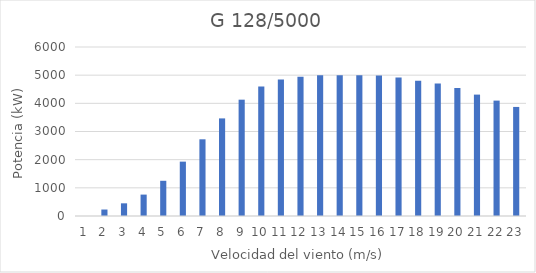
| Category | G 128/5000 |
|---|---|
| 0 | 0 |
| 1 | 230 |
| 2 | 450 |
| 3 | 760 |
| 4 | 1250 |
| 5 | 1930 |
| 6 | 2723 |
| 7 | 3465 |
| 8 | 4130 |
| 9 | 4600 |
| 10 | 4850 |
| 11 | 4940 |
| 12 | 5000 |
| 13 | 5000 |
| 14 | 5000 |
| 15 | 4992 |
| 16 | 4916 |
| 17 | 4802 |
| 18 | 4700 |
| 19 | 4545 |
| 20 | 4310 |
| 21 | 4097 |
| 22 | 3872 |